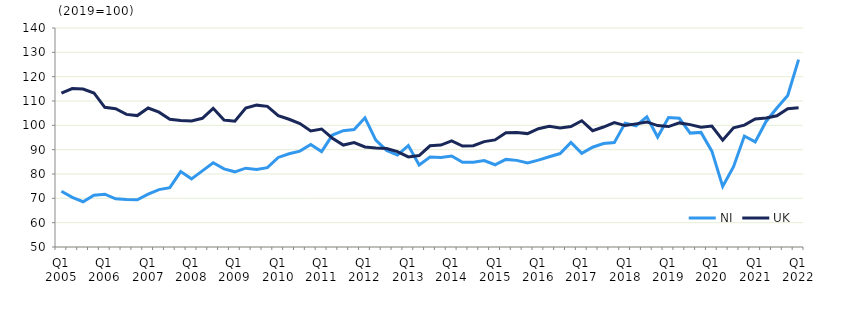
| Category | NI | UK  |
|---|---|---|
| Q1 2005 | 72.9 | 113.2 |
|  | 70.4 | 115.1 |
| Q3 2005 | 68.6 | 114.9 |
|  | 71.3 | 113.3 |
| Q1 2006 | 71.7 | 107.4 |
|  | 69.8 | 106.8 |
| Q3 2006 | 69.5 | 104.5 |
|  | 69.4 | 104 |
| Q1 2007 | 71.7 | 107.1 |
|  | 73.6 | 105.4 |
| Q3 2007 | 74.4 | 102.5 |
|  | 81 | 102 |
| Q1 2008 | 78 | 101.8 |
|  | 81.3 | 102.9 |
| Q3 2008 | 84.6 | 107 |
|  | 82.1 | 102.2 |
| Q1 2009 | 80.9 | 101.7 |
|  | 82.4 | 107.1 |
| Q3 2009 | 81.9 | 108.3 |
|  | 82.6 | 107.8 |
| Q1 2010 | 86.8 | 104 |
|  | 88.3 | 102.5 |
| Q3 2010 | 89.4 | 100.7 |
|  | 92.1 | 97.7 |
| Q1 2011 | 89.2 | 98.5 |
|  | 96 | 94.7 |
| Q3 2011 | 97.8 | 91.9 |
|  | 98.3 | 92.9 |
| Q1 2012 | 103.1 | 91.1 |
|  | 93.9 | 90.7 |
| Q3 2012 | 89.7 | 90.5 |
|  | 87.8 | 89.2 |
| Q1 2013 | 91.7 | 87 |
|  | 83.7 | 87.6 |
| Q3 2013 | 87 | 91.6 |
|  | 86.8 | 91.9 |
| Q1 2014 | 87.4 | 93.6 |
|  | 84.8 | 91.5 |
| Q3 2014 | 84.8 | 91.6 |
|  | 85.5 | 93.3 |
| Q1 2015 | 83.8 | 94 |
|  | 86 | 97 |
| Q3 2015 | 85.6 | 97.1 |
|  | 84.5 | 96.6 |
| Q1 2016 | 85.7 | 98.6 |
|  | 87.1 | 99.6 |
| Q3 2016 | 88.4 | 98.9 |
|  | 93 | 99.5 |
| Q1 2017 | 88.5 | 101.9 |
|  | 91 | 97.8 |
| Q3 2017 | 92.5 | 99.3 |
|  | 92.9 | 101.1 |
| Q1 2018 | 100.9 | 99.9 |
|  | 99.8 | 100.6 |
| Q3 2018 | 103.5 | 101.4 |
|  | 95.2 | 99.9 |
| Q1 2019 | 103.2 | 99.5 |
|  | 102.9 | 101 |
| Q3 2019 | 96.8 | 100.3 |
|  | 97.1 | 99.2 |
| Q1 2020 | 89.4 | 99.7 |
|  | 74.9 | 93.9 |
| Q3 2020 | 83 | 99 |
|  | 95.6 | 100.1 |
| Q1 2021 | 93.2 | 102.6 |
|  | 101.6 | 103 |
| Q3 2021 | 107.1 | 103.9 |
|  | 112.3 | 106.8 |
| Q1 2022 | 127 | 107.2 |